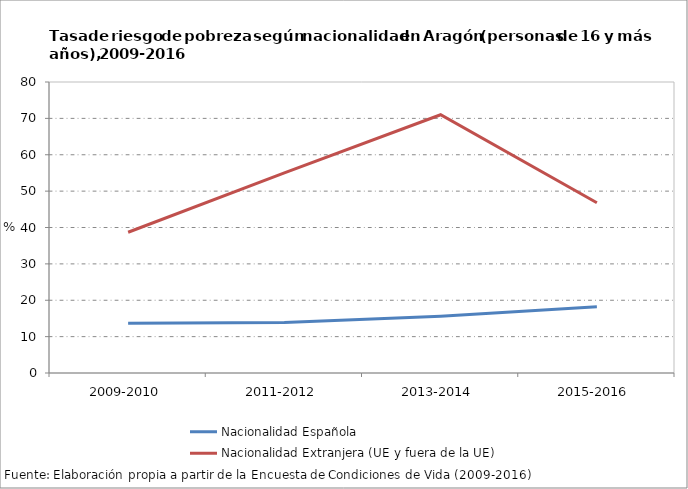
| Category | Nacionalidad Española | Nacionalidad Extranjera (UE y fuera de la UE) |
|---|---|---|
| 2009-2010 | 13.7 | 38.7 |
| 2011-2012 | 13.9 | 55 |
| 2013-2014 | 15.6 | 71 |
| 2015-2016 | 18.2 | 46.8 |